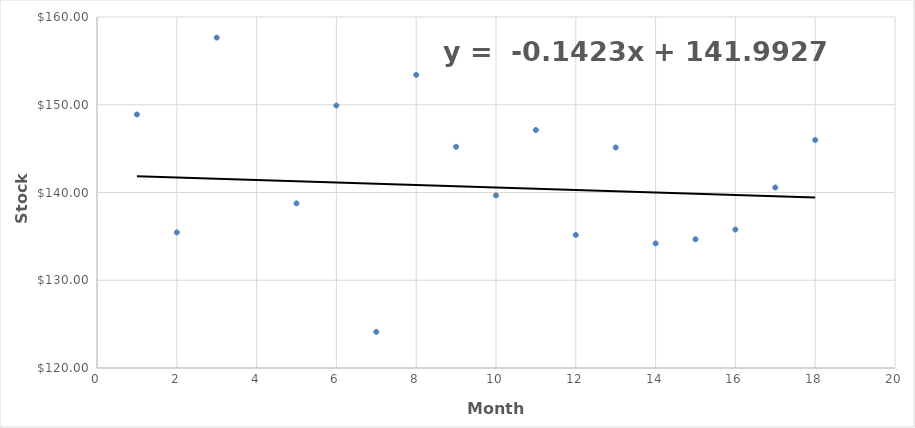
| Category | Series 0 |
|---|---|
| 1.0 | 148.89 |
| 2.0 | 135.45 |
| 3.0 | 157.65 |
| 4.0 | 119.87 |
| 5.0 | 138.76 |
| 6.0 | 149.91 |
| 7.0 | 124.12 |
| 8.0 | 153.4 |
| 9.0 | 145.21 |
| 10.0 | 139.67 |
| 11.0 | 147.12 |
| 12.0 | 135.16 |
| 13.0 | 145.13 |
| 14.0 | 134.2 |
| 15.0 | 134.67 |
| 16.0 | 135.78 |
| 17.0 | 140.57 |
| 18.0 | 145.98 |